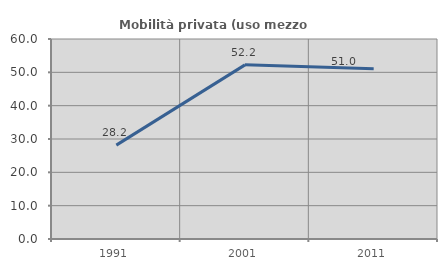
| Category | Mobilità privata (uso mezzo privato) |
|---|---|
| 1991.0 | 28.165 |
| 2001.0 | 52.239 |
| 2011.0 | 51.046 |